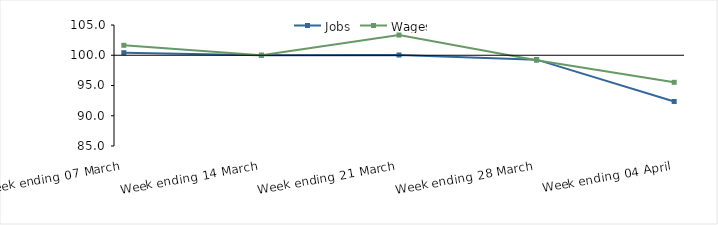
| Category | Jobs | Wages |
|---|---|---|
| 0 | 100.422 | 101.644 |
| 1900-01-01 | 100 | 100 |
| 1900-01-02 | 100.039 | 103.341 |
| 1900-01-03 | 99.27 | 99.182 |
| 1900-01-04 | 92.361 | 95.526 |